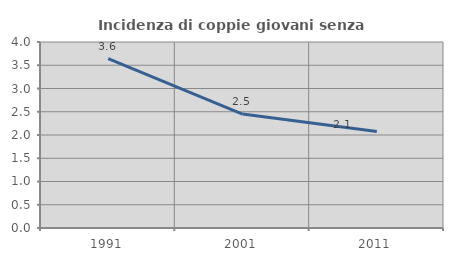
| Category | Incidenza di coppie giovani senza figli |
|---|---|
| 1991.0 | 3.644 |
| 2001.0 | 2.45 |
| 2011.0 | 2.074 |